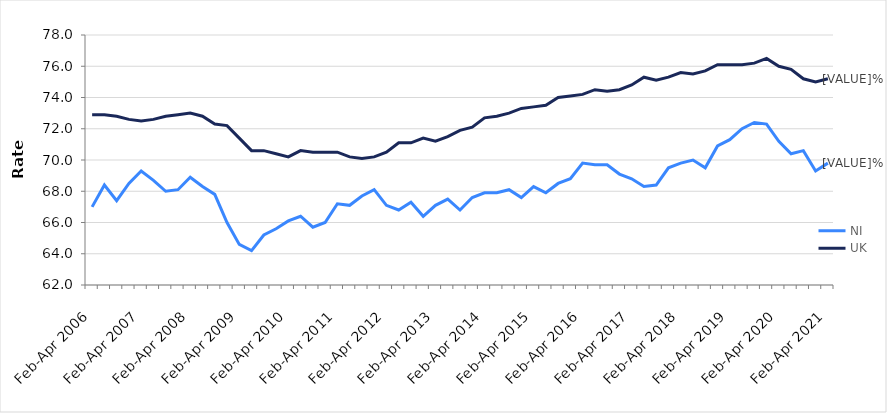
| Category | NI | UK |
|---|---|---|
| Feb-Apr 2006 | 67 | 72.9 |
| May-Jul 2006 | 68.4 | 72.9 |
| Aug-Oct 2006 | 67.4 | 72.8 |
| Nov-Jan 2007 | 68.5 | 72.6 |
| Feb-Apr 2007 | 69.3 | 72.5 |
| May-Jul 2007 | 68.7 | 72.6 |
| Aug-Oct 2007 | 68 | 72.8 |
| Nov-Jan 2008 | 68.1 | 72.9 |
| Feb-Apr 2008 | 68.9 | 73 |
| May-Jul 2008 | 68.3 | 72.8 |
| Aug-Oct 2008 | 67.8 | 72.3 |
| Nov-Jan 2009 | 66 | 72.2 |
| Feb-Apr 2009 | 64.6 | 71.4 |
| May-Jul 2009 | 64.2 | 70.6 |
| Aug-Oct 2009 | 65.2 | 70.6 |
| Nov-Jan 2010 | 65.6 | 70.4 |
| Feb-Apr 2010 | 66.1 | 70.2 |
| May-Jul 2010 | 66.4 | 70.6 |
| Aug-Oct 2010 | 65.7 | 70.5 |
| Nov-Jan 2011 | 66 | 70.5 |
| Feb-Apr 2011 | 67.2 | 70.5 |
| May-Jul 2011 | 67.1 | 70.2 |
| Aug-Oct 2011 | 67.7 | 70.1 |
| Nov-Jan 2012 | 68.1 | 70.2 |
| Feb-Apr 2012 | 67.1 | 70.5 |
| May-Jul 2012 | 66.8 | 71.1 |
| Aug-Oct 2012 | 67.3 | 71.1 |
| Nov-Jan 2013 | 66.4 | 71.4 |
| Feb-Apr 2013 | 67.1 | 71.2 |
| May-Jul 2013 | 67.5 | 71.5 |
| Aug-Oct 2013 | 66.8 | 71.9 |
| Nov-Jan 2014 | 67.6 | 72.1 |
| Feb-Apr 2014 | 67.9 | 72.7 |
| May-Jul 2014 | 67.9 | 72.8 |
| Aug-Oct 2014 | 68.1 | 73 |
| Nov-Jan 2015 | 67.6 | 73.3 |
| Feb-Apr 2015 | 68.3 | 73.4 |
| May-Jul 2015 | 67.9 | 73.5 |
| Aug-Oct 2015 | 68.5 | 74 |
| Nov-Jan 2016 | 68.8 | 74.1 |
| Feb-Apr 2016 | 69.8 | 74.2 |
| May-Jul 2016 | 69.7 | 74.5 |
| Aug-Oct 2016 | 69.7 | 74.4 |
| Nov-Jan 2017 | 69.1 | 74.5 |
| Feb-Apr 2017 | 68.8 | 74.8 |
| May-Jul 2017 | 68.3 | 75.3 |
| Aug-Oct 2017 | 68.4 | 75.1 |
| Nov-Jan 2018 | 69.5 | 75.3 |
| Feb-Apr 2018 | 69.8 | 75.6 |
| May-Jul 2018 | 70 | 75.5 |
| Aug-Oct 2018 | 69.5 | 75.7 |
| Nov-Jan 2019 | 70.9 | 76.1 |
| Feb-Apr 2019 | 71.3 | 76.1 |
| May-Jul 2019 | 72 | 76.1 |
| Aug-Oct 2019 | 72.4 | 76.2 |
| Nov-Jan 2020 | 72.3 | 76.5 |
| Feb-Apr 2020 | 71.2 | 76 |
| May-Jul 2020 | 70.4 | 75.8 |
| Aug-Oct 2020 | 70.6 | 75.2 |
| Nov-Jan 2021 | 69.3 | 75 |
| Feb-Apr 2021 | 69.8 | 75.2 |